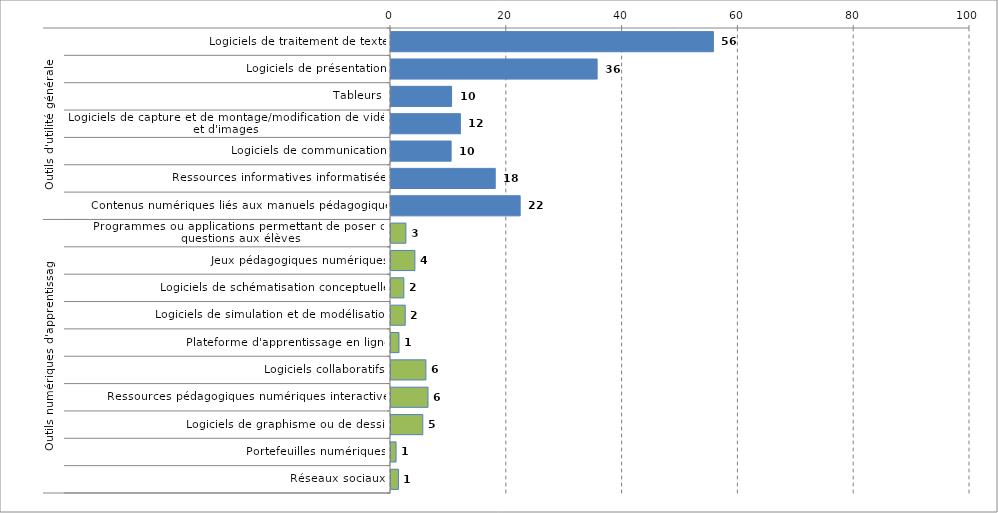
| Category |  % France |
|---|---|
| 0 | 55.682 |
| 1 | 35.603 |
| 2 | 10.463 |
| 3 | 11.983 |
| 4 | 10.386 |
| 5 | 18.005 |
| 6 | 22.312 |
| 7 | 2.574 |
| 8 | 4.124 |
| 9 | 2.216 |
| 10 | 2.458 |
| 11 | 1.378 |
| 12 | 6.025 |
| 13 | 6.388 |
| 14 | 5.489 |
| 15 | 0.877 |
| 16 | 1.281 |